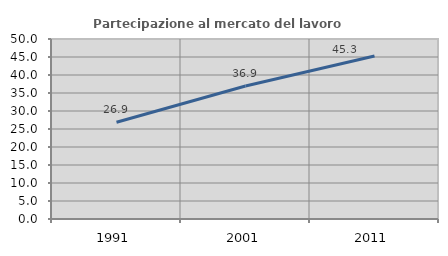
| Category | Partecipazione al mercato del lavoro  femminile |
|---|---|
| 1991.0 | 26.857 |
| 2001.0 | 36.943 |
| 2011.0 | 45.27 |